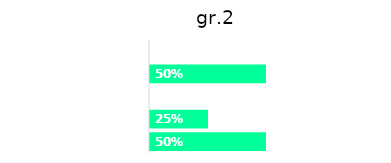
| Category | gr.2 |
|---|---|
| tellen en getalbegrip | 0.5 |
| meten en wegen | 0.25 |
| meetkunde | 0 |
| tijd | 0.5 |